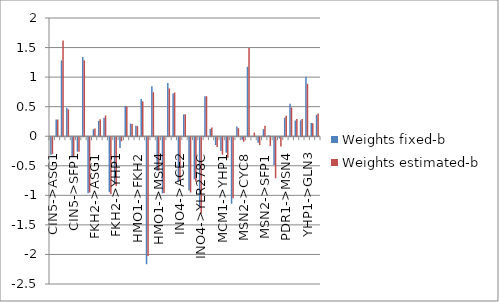
| Category | Weights fixed-b | Weights estimated-b |
|---|---|---|
| CIN5->ASG1 | -0.296 | -0.285 |
| CIN5->CYC8 | 0.281 | 0.282 |
| CIN5->MIG2 | 1.283 | 1.617 |
| CIN5->PDR1 | 0.48 | 0.455 |
| CIN5->SFP1 | -0.335 | -0.331 |
| CIN5->STP5 | -0.245 | -0.244 |
| CIN5->YHP1 | 1.339 | 1.284 |
| FKH2->ACE2 | -0.949 | -0.935 |
| FKH2->ASG1 | 0.119 | 0.131 |
| FKH2->SFP1 | 0.259 | 0.285 |
| FKH2->SNF6 | 0.314 | 0.351 |
| FKH2->SWI5 | -0.93 | -0.962 |
| FKH2->YHP1 | -0.785 | -0.825 |
| GCR2->MSN2 | -0.184 | -0.069 |
| HMO1->CIN5 | 0.513 | 0.505 |
| HMO1->CYC8 | 0.214 | 0.205 |
| HMO1->FKH2 | 0.177 | 0.171 |
| HMO1->HMO1 | 0.629 | 0.589 |
| HMO1->MCM1 | -2.148 | -2.011 |
| HMO1->MSN2 | 0.846 | 0.746 |
| HMO1->MSN4 | -0.567 | -0.567 |
| HMO1->SNF6 | -0.95 | -0.943 |
| HMO1->YLR278C | 0.902 | 0.809 |
| HMO1->YOX1 | 0.724 | 0.74 |
| INO4->ACE2 | -0.76 | -0.746 |
| INO4->GCR2 | 0.369 | 0.37 |
| INO4->SWI5 | -0.903 | -0.935 |
| INO4->YHP1 | -0.713 | -0.755 |
| INO4->YLR278C | -1.188 | -1.29 |
| MCM1->ACE2 | 0.674 | 0.677 |
| MCM1->SNF6 | 0.125 | 0.146 |
| MCM1->SWI5 | -0.132 | -0.167 |
| MCM1->YHP1 | -0.234 | -0.295 |
| MCM1->YOX1 | -0.261 | -0.345 |
| MIG2->RIF1 | -1.125 | -1.032 |
| MSN2->CIN5 | 0.166 | 0.137 |
| MSN2->CYC8 | -0.045 | -0.076 |
| MSN2->MIG2 | 1.173 | 1.493 |
| MSN2->MSN4 | 0.002 | 0.062 |
| MSN2->PDR1 | -0.094 | -0.133 |
| MSN2->SFP1 | 0.12 | 0.178 |
| MSN2->YHP1 | 0.015 | -0.147 |
| MSN2->YLR278C | -0.469 | -0.694 |
| MSN2->YOX1 | -0.022 | -0.158 |
| PDR1->MSN4 | 0.315 | 0.347 |
| SFP1->SWI5 | 0.551 | 0.485 |
| STB5->MSN4 | 0.265 | 0.291 |
| STB5->SFP1 | 0.268 | 0.292 |
| YHP1->GLN3 | 1.007 | 0.887 |
| YOX1->SNF5 | 0.224 | 0.218 |
| ZAP1->ACE2 | 0.362 | 0.385 |